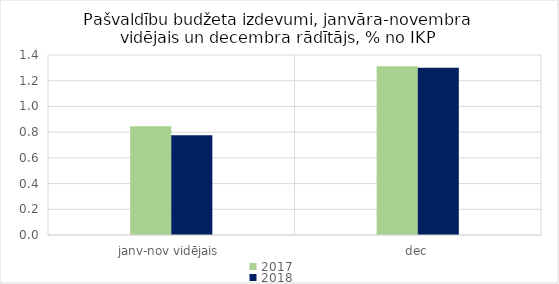
| Category | 2017 | 2018 |
|---|---|---|
| janv-nov vidējais | 0.846 | 0.776 |
| dec | 1.312 | 1.302 |